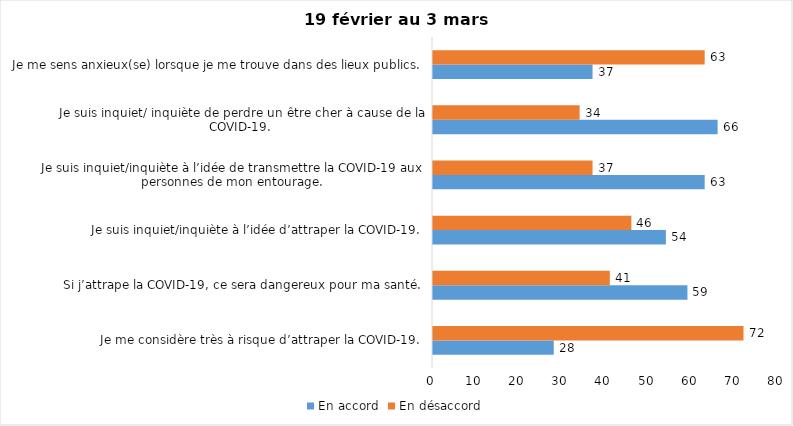
| Category | En accord | En désaccord |
|---|---|---|
| Je me considère très à risque d’attraper la COVID-19. | 28 | 72 |
| Si j’attrape la COVID-19, ce sera dangereux pour ma santé. | 59 | 41 |
| Je suis inquiet/inquiète à l’idée d’attraper la COVID-19. | 54 | 46 |
| Je suis inquiet/inquiète à l’idée de transmettre la COVID-19 aux personnes de mon entourage. | 63 | 37 |
| Je suis inquiet/ inquiète de perdre un être cher à cause de la COVID-19. | 66 | 34 |
| Je me sens anxieux(se) lorsque je me trouve dans des lieux publics. | 37 | 63 |